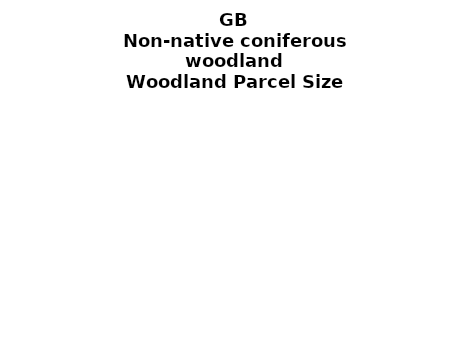
| Category | Non-native coniferous woodland |
|---|---|
| <5 ha | 0.041 |
| ≥5 and <10 ha | 0.021 |
| ≥10 and <15 ha | 0.016 |
| ≥15 and <20 ha | 0.015 |
| ≥20 and <25 ha | 0.013 |
| ≥25 and <30 ha | 0.013 |
| ≥30 and <35 ha | 0.011 |
| ≥35 and <40 ha | 0.01 |
| ≥40 and <45 ha | 0.007 |
| ≥45 and <50 ha | 0.008 |
| ≥50 and <60 ha | 0.019 |
| ≥60 and <70 ha | 0.017 |
| ≥70 and <80 ha | 0.015 |
| ≥80 and <90 ha | 0.012 |
| ≥90 and <100 ha | 0.014 |
| ≥100 and <150 ha | 0.046 |
| ≥150 and <200 ha | 0.039 |
| ≥200 ha | 0.683 |